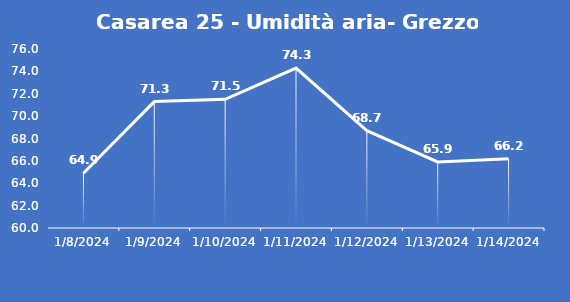
| Category | Casarea 25 - Umidità aria- Grezzo (%) |
|---|---|
| 1/8/24 | 64.9 |
| 1/9/24 | 71.3 |
| 1/10/24 | 71.5 |
| 1/11/24 | 74.3 |
| 1/12/24 | 68.7 |
| 1/13/24 | 65.9 |
| 1/14/24 | 66.2 |